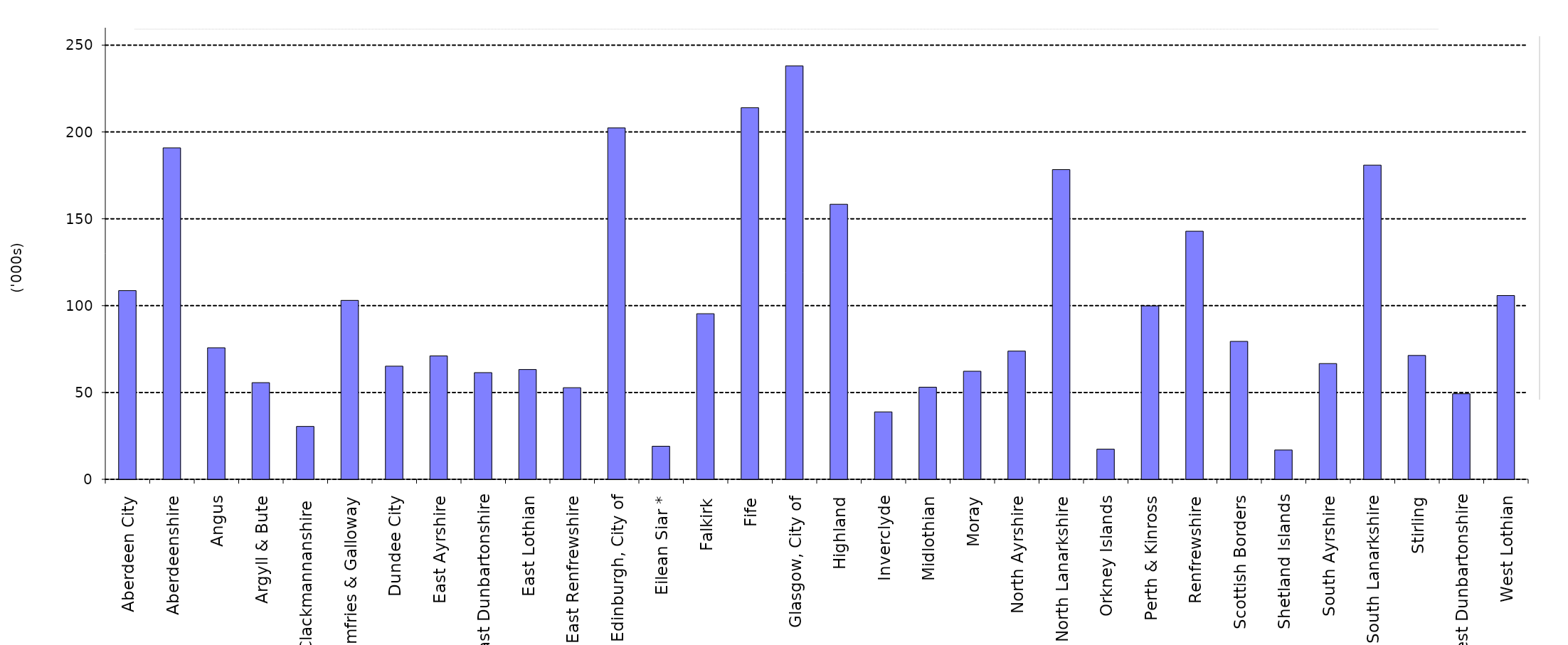
| Category | Series 0 |
|---|---|
| Aberdeen City | 108.653 |
| Aberdeenshire | 190.831 |
| Angus | 75.736 |
| Argyll & Bute | 55.652 |
| Clackmannanshire  | 30.44 |
| Dumfries & Galloway | 103.029 |
| Dundee City | 65.145 |
| East Ayrshire | 71.064 |
| East Dunbartonshire | 61.427 |
| East Lothian | 63.213 |
| East Renfrewshire | 52.752 |
| Edinburgh, City of | 202.319 |
| Eilean Siar * | 19.04 |
| Falkirk | 95.345 |
| Fife | 213.972 |
| Glasgow, City of | 238.001 |
| Highland | 158.361 |
| Inverclyde | 38.815 |
| Midlothian | 53.042 |
| Moray | 62.228 |
| North Ayrshire | 73.819 |
| North Lanarkshire | 178.317 |
| Orkney Islands | 17.347 |
| Perth & Kinross | 99.837 |
| Renfrewshire | 142.851 |
| Scottish Borders | 79.412 |
| Shetland Islands | 16.864 |
| South Ayrshire | 66.647 |
| South Lanarkshire | 180.896 |
| Stirling | 71.311 |
| West Dunbartonshire | 49.261 |
| West Lothian | 105.814 |